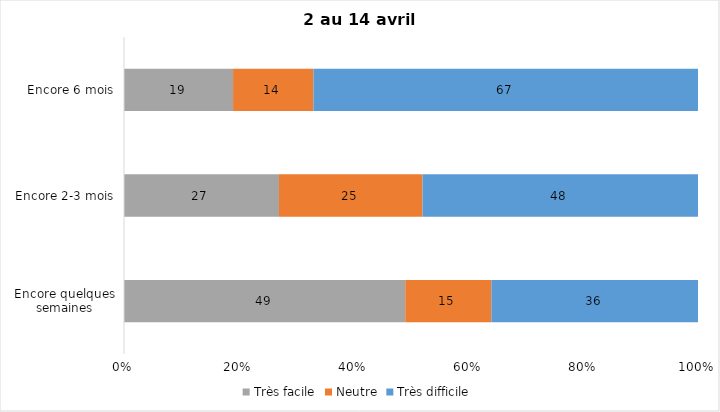
| Category | Très facile | Neutre | Très difficile |
|---|---|---|---|
| Encore quelques semaines | 49 | 15 | 36 |
| Encore 2-3 mois | 27 | 25 | 48 |
| Encore 6 mois | 19 | 14 | 67 |